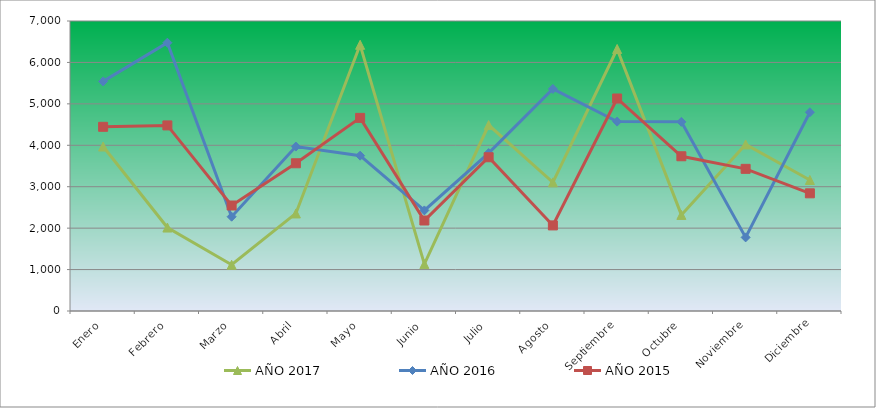
| Category | AÑO 2017 | AÑO 2016 | AÑO 2015 |
|---|---|---|---|
| Enero | 3970.271 | 5542.048 | 4446.084 |
| Febrero | 2014.587 | 6476.441 | 4479.56 |
| Marzo | 1115.775 | 2276.417 | 2546.357 |
| Abril | 2354.874 | 3969.358 | 3565.84 |
| Mayo | 6424.891 | 3749.751 | 4661.909 |
| Junio | 1132.224 | 2428.455 | 2184.346 |
| Julio | 4487.581 | 3811.943 | 3711.324 |
| Agosto | 3105.118 | 5360.722 | 2065.979 |
| Septiembre | 6324.619 | 4571.789 | 5129.519 |
| Octubre | 2319.278 | 4565.443 | 3735.08 |
| Noviembre | 4020.665 | 1777.033 | 3431.437 |
| Diciembre | 3162.581 | 4796.996 | 2840.47 |